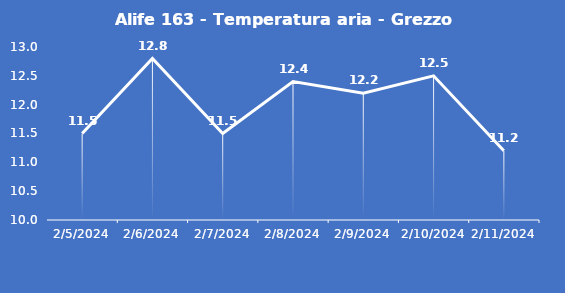
| Category | Alife 163 - Temperatura aria - Grezzo (°C) |
|---|---|
| 2/5/24 | 11.5 |
| 2/6/24 | 12.8 |
| 2/7/24 | 11.5 |
| 2/8/24 | 12.4 |
| 2/9/24 | 12.2 |
| 2/10/24 | 12.5 |
| 2/11/24 | 11.2 |